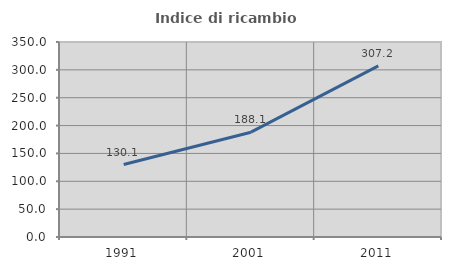
| Category | Indice di ricambio occupazionale  |
|---|---|
| 1991.0 | 130.12 |
| 2001.0 | 188.112 |
| 2011.0 | 307.216 |